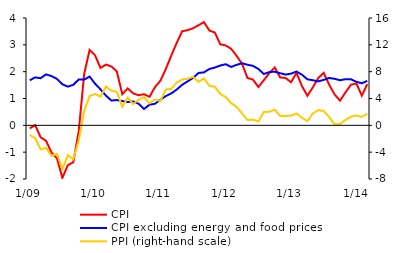
| Category | CPI | CPI excluding energy and food prices |
|---|---|---|
| 1/09 | -0.114 | 1.68 |
| 2 | 0.008 | 1.786 |
| 3 | -0.446 | 1.756 |
| 4 | -0.576 | 1.899 |
| 5 | -1.016 | 1.835 |
| 6 | -1.229 | 1.73 |
| 7 | -1.959 | 1.53 |
| 8 | -1.484 | 1.441 |
| 9 | -1.378 | 1.51 |
| 10 | -0.224 | 1.709 |
| 11 | 1.915 | 1.705 |
| 12 | 2.814 | 1.816 |
| 1/10 | 2.611 | 1.554 |
| 2 | 2.137 | 1.34 |
| 3 | 2.264 | 1.107 |
| 4 | 2.194 | 0.923 |
| 5 | 2.008 | 0.942 |
| 6 | 1.162 | 0.904 |
| 7 | 1.374 | 0.87 |
| 8 | 1.191 | 0.89 |
| 9 | 1.121 | 0.804 |
| 10 | 1.162 | 0.611 |
| 11 | 1.063 | 0.768 |
| 12 | 1.422 | 0.804 |
| 1/11 | 1.663 | 0.95 |
| 2 | 2.101 | 1.092 |
| 3 | 2.6 | 1.19 |
| 4 | 3.073 | 1.335 |
| 5 | 3.506 | 1.51 |
| 6 | 3.546 | 1.639 |
| 7 | 3.618 | 1.765 |
| 8 | 3.732 | 1.951 |
| 9 | 3.845 | 1.975 |
| 10 | 3.532 | 2.1 |
| 11 | 3.458 | 2.153 |
| 12 | 3.019 | 2.23 |
| 1/12 | 2.978 | 2.277 |
| 2 | 2.85 | 2.177 |
| 3 | 2.591 | 2.255 |
| 4 | 2.289 | 2.314 |
| 5 | 1.763 | 2.257 |
| 6 | 1.705 | 2.218 |
| 7 | 1.43 | 2.1 |
| 8 | 1.682 | 1.913 |
| 9 | 1.946 | 1.985 |
| 10 | 2.157 | 1.999 |
| 11 | 1.785 | 1.941 |
| 12 | 1.764 | 1.893 |
| 1/13 | 1.605 | 1.925 |
| 2 | 1.955 | 2.004 |
| 3 | 1.462 | 1.887 |
| 4 | 1.101 | 1.715 |
| 5 | 1.416 | 1.681 |
| 6 | 1.763 | 1.636 |
| 7 | 1.955 | 1.696 |
| 8 | 1.514 | 1.765 |
| 9 | 1.15 | 1.734 |
| 10 | 0.919 | 1.68 |
| 11 | 1.23 | 1.721 |
| 12 | 1.512 | 1.717 |
|  1/14 | 1.561 | 1.621 |
| 2 | 1.105 | 1.567 |
| 3 | 1.536 | 1.657 |